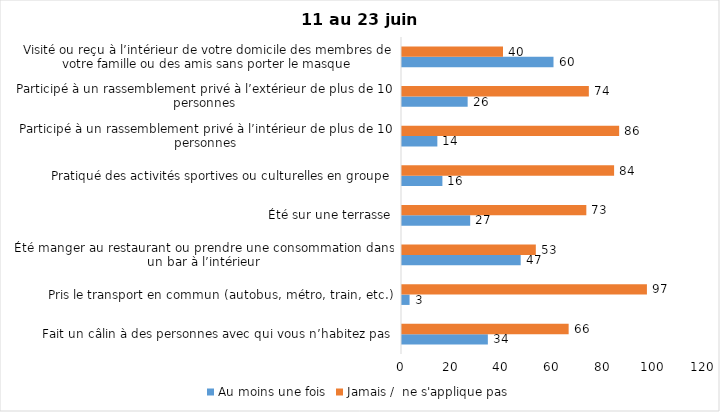
| Category | Au moins une fois | Jamais /  ne s'applique pas |
|---|---|---|
| Fait un câlin à des personnes avec qui vous n’habitez pas | 34 | 66 |
| Pris le transport en commun (autobus, métro, train, etc.) | 3 | 97 |
| Été manger au restaurant ou prendre une consommation dans un bar à l’intérieur | 47 | 53 |
| Été sur une terrasse | 27 | 73 |
| Pratiqué des activités sportives ou culturelles en groupe | 16 | 84 |
| Participé à un rassemblement privé à l’intérieur de plus de 10 personnes | 14 | 86 |
| Participé à un rassemblement privé à l’extérieur de plus de 10 personnes | 26 | 74 |
| Visité ou reçu à l’intérieur de votre domicile des membres de votre famille ou des amis sans porter le masque | 60 | 40 |